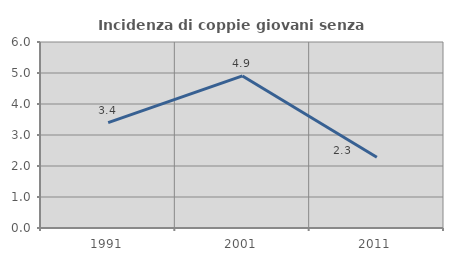
| Category | Incidenza di coppie giovani senza figli |
|---|---|
| 1991.0 | 3.4 |
| 2001.0 | 4.906 |
| 2011.0 | 2.281 |